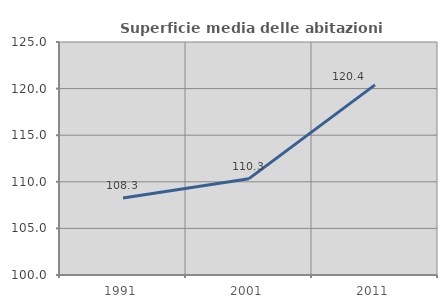
| Category | Superficie media delle abitazioni occupate |
|---|---|
| 1991.0 | 108.263 |
| 2001.0 | 110.337 |
| 2011.0 | 120.399 |